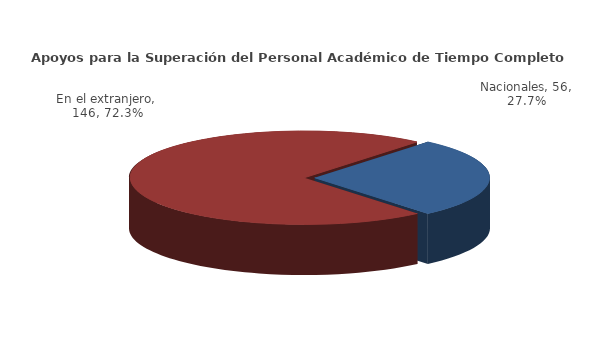
| Category | Series 0 |
|---|---|
| Nacionales | 56 |
| En el extranjero | 146 |